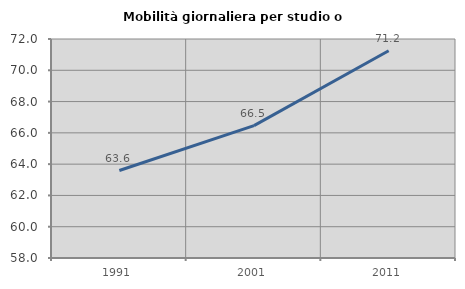
| Category | Mobilità giornaliera per studio o lavoro |
|---|---|
| 1991.0 | 63.592 |
| 2001.0 | 66.459 |
| 2011.0 | 71.248 |